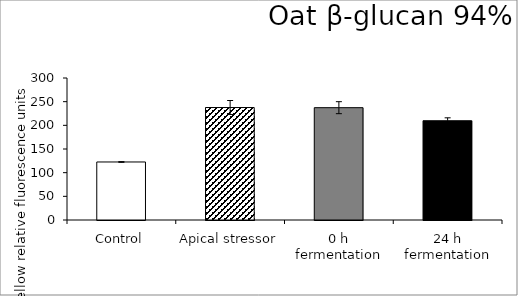
| Category | average |
|---|---|
| Control | 122.583 |
| Apical stressor | 237.617 |
| 0 h fermentation | 237.295 |
| 24 h fermentation | 209.713 |